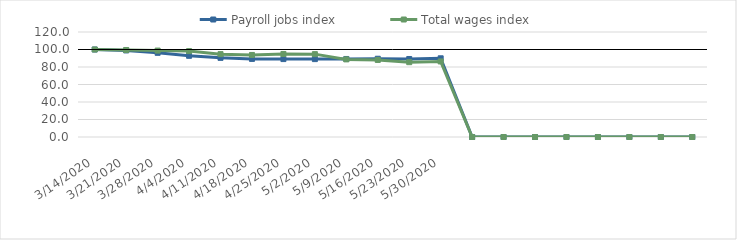
| Category | Payroll jobs index | Total wages index |
|---|---|---|
| 14/03/2020 | 100 | 100 |
| 21/03/2020 | 98.934 | 99.431 |
| 28/03/2020 | 96.206 | 98.783 |
| 04/04/2020 | 92.789 | 98.173 |
| 11/04/2020 | 90.447 | 94.707 |
| 18/04/2020 | 89.236 | 93.751 |
| 25/04/2020 | 89.051 | 94.901 |
| 02/05/2020 | 89.007 | 94.705 |
| 09/05/2020 | 89.163 | 88.711 |
| 16/05/2020 | 89.438 | 88.049 |
| 23/05/2020 | 89.148 | 85.516 |
| 30/05/2020 | 89.942 | 86.327 |